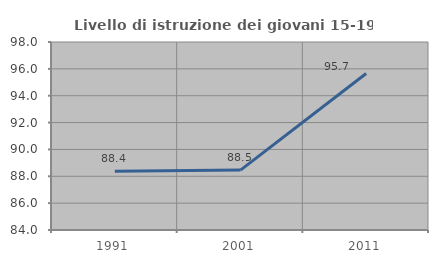
| Category | Livello di istruzione dei giovani 15-19 anni |
|---|---|
| 1991.0 | 88.372 |
| 2001.0 | 88.462 |
| 2011.0 | 95.652 |